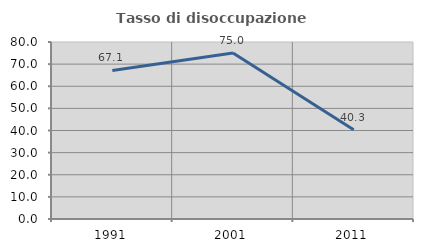
| Category | Tasso di disoccupazione giovanile  |
|---|---|
| 1991.0 | 67.143 |
| 2001.0 | 75 |
| 2011.0 | 40.299 |